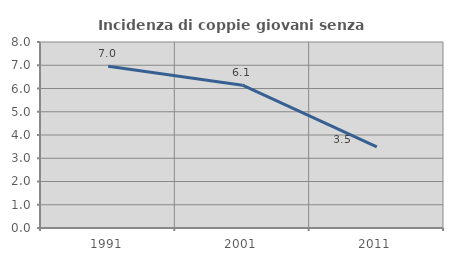
| Category | Incidenza di coppie giovani senza figli |
|---|---|
| 1991.0 | 6.957 |
| 2001.0 | 6.144 |
| 2011.0 | 3.493 |